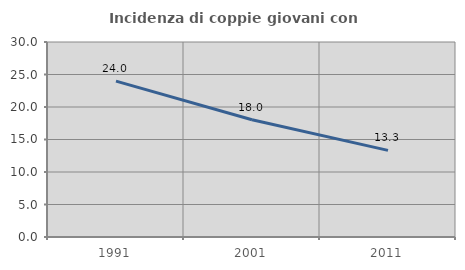
| Category | Incidenza di coppie giovani con figli |
|---|---|
| 1991.0 | 23.987 |
| 2001.0 | 18.044 |
| 2011.0 | 13.33 |